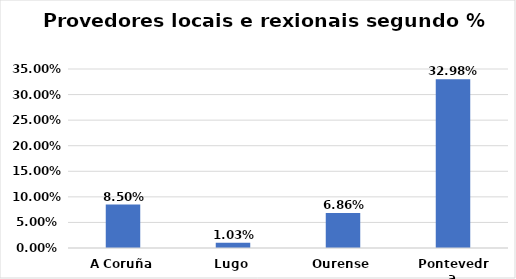
| Category | % facturado sobre TOTAL |
|---|---|
| A Coruña | 0.085 |
| Lugo | 0.01 |
| Ourense | 0.069 |
| Pontevedra | 0.33 |